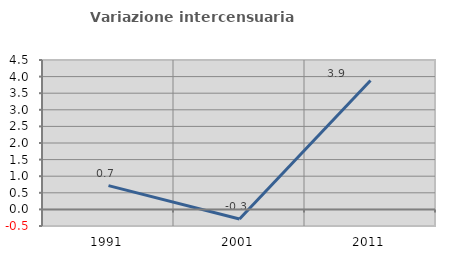
| Category | Variazione intercensuaria annua |
|---|---|
| 1991.0 | 0.716 |
| 2001.0 | -0.291 |
| 2011.0 | 3.885 |